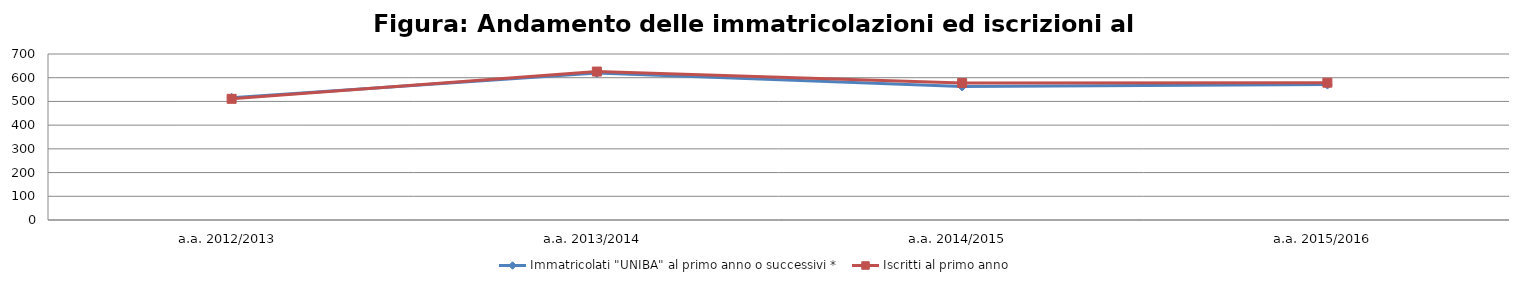
| Category | Immatricolati "UNIBA" al primo anno o successivi * | Iscritti al primo anno  |
|---|---|---|
| a.a. 2012/2013 | 515 | 511 |
| a.a. 2013/2014 | 620 | 626 |
| a.a. 2014/2015 | 563 | 578 |
| a.a. 2015/2016 | 571 | 579 |